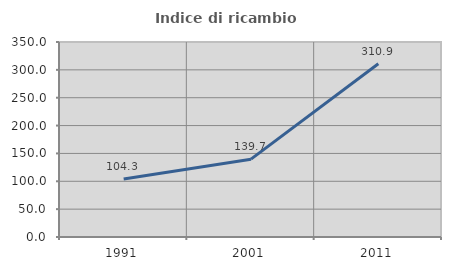
| Category | Indice di ricambio occupazionale  |
|---|---|
| 1991.0 | 104.285 |
| 2001.0 | 139.709 |
| 2011.0 | 310.926 |